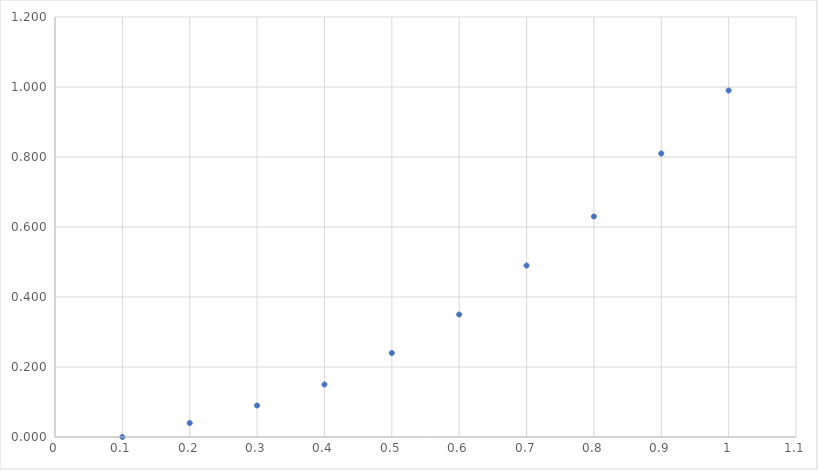
| Category | y |
|---|---|
| 0.1 | 0 |
| 0.2 | 0.04 |
| 0.30000000000000004 | 0.09 |
| 0.4 | 0.15 |
| 0.5 | 0.24 |
| 0.6 | 0.35 |
| 0.7 | 0.49 |
| 0.7999999999999999 | 0.63 |
| 0.8999999999999999 | 0.81 |
| 0.9999999999999999 | 0.99 |